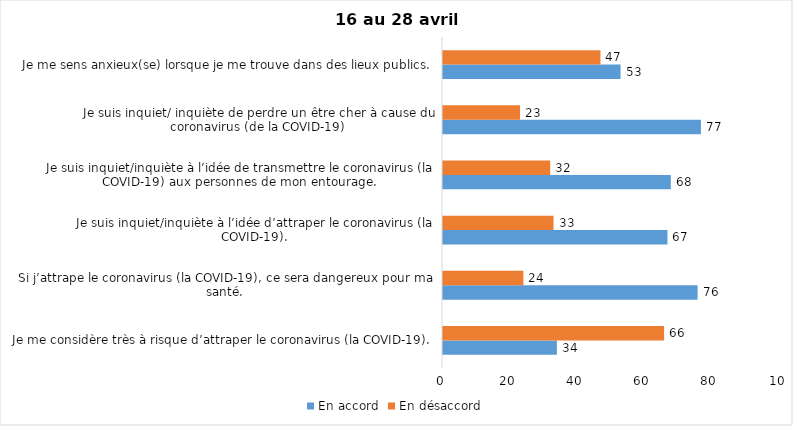
| Category | En accord | En désaccord |
|---|---|---|
| Je me considère très à risque d’attraper le coronavirus (la COVID-19). | 34 | 66 |
| Si j’attrape le coronavirus (la COVID-19), ce sera dangereux pour ma santé. | 76 | 24 |
| Je suis inquiet/inquiète à l’idée d’attraper le coronavirus (la COVID-19). | 67 | 33 |
| Je suis inquiet/inquiète à l’idée de transmettre le coronavirus (la COVID-19) aux personnes de mon entourage. | 68 | 32 |
| Je suis inquiet/ inquiète de perdre un être cher à cause du coronavirus (de la COVID-19) | 77 | 23 |
| Je me sens anxieux(se) lorsque je me trouve dans des lieux publics. | 53 | 47 |